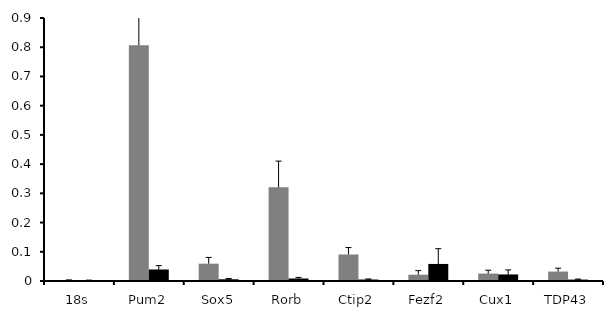
| Category | UV | Non UV |
|---|---|---|
| 18s | 0.003 | 0.002 |
| Pum2 | 0.806 | 0.039 |
| Sox5 | 0.059 | 0.006 |
| Rorb | 0.321 | 0.009 |
| Ctip2 | 0.091 | 0.005 |
| Fezf2 | 0.022 | 0.058 |
| Cux1 | 0.025 | 0.022 |
| TDP43 | 0.032 | 0.005 |